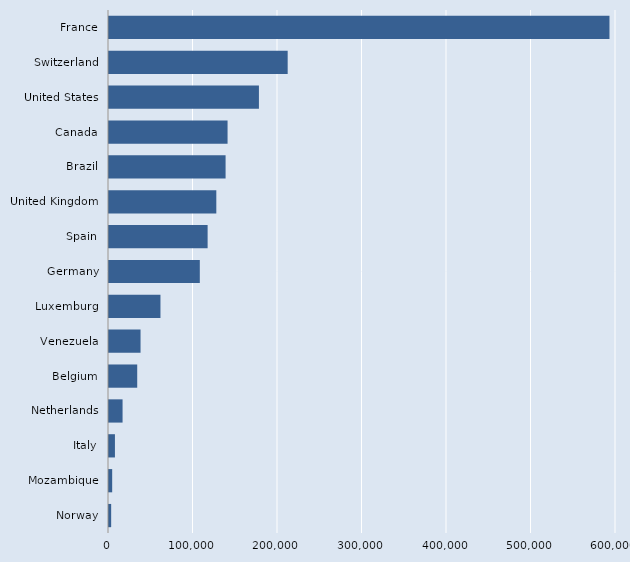
| Category | Series 0 |
|---|---|
| Norway | 2560 |
| Mozambique | 3767 |
| Italy | 7023 |
| Netherlands | 16054 |
| Belgium | 33388 |
| Venezuela | 37326 |
| Luxemburg | 60897 |
| Germany | 107470 |
| Spain | 116710 |
| United Kingdom | 127000 |
| Brazil | 137973 |
| Canada | 140310 |
| United States | 177431 |
| Switzerland | 211451 |
| France | 592281 |